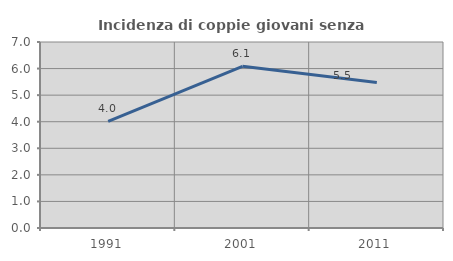
| Category | Incidenza di coppie giovani senza figli |
|---|---|
| 1991.0 | 4.016 |
| 2001.0 | 6.084 |
| 2011.0 | 5.479 |